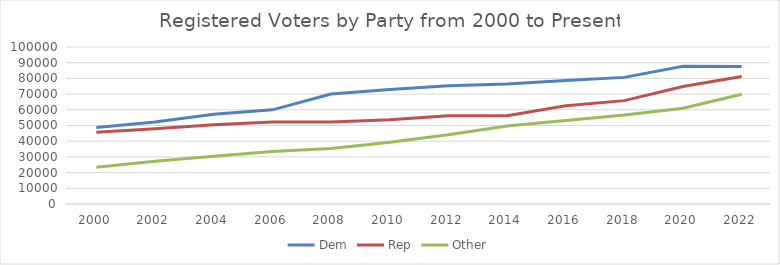
| Category | Dem | Rep | Other |
|---|---|---|---|
| 2000.0 | 48684 | 45638 | 23463 |
| 2002.0 | 52217 | 47972 | 27247 |
| 2004.0 | 57128 | 50436 | 30387 |
| 2006.0 | 59957 | 52264 | 33395 |
| 2008.0 | 70065 | 52250 | 35356 |
| 2010.0 | 72860 | 53602 | 39356 |
| 2012.0 | 75333 | 56137 | 44048 |
| 2014.0 | 76368 | 56211 | 49675 |
| 2016.0 | 78611 | 62548 | 53209 |
| 2018.0 | 80648 | 65836 | 56647 |
| 2020.0 | 87800 | 74796 | 61044 |
| 2022.0 | 87579 | 81215 | 69851 |